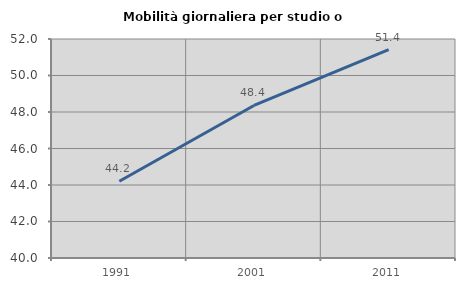
| Category | Mobilità giornaliera per studio o lavoro |
|---|---|
| 1991.0 | 44.208 |
| 2001.0 | 48.359 |
| 2011.0 | 51.414 |